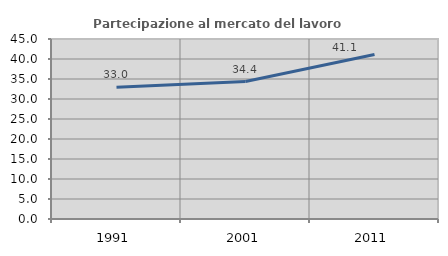
| Category | Partecipazione al mercato del lavoro  femminile |
|---|---|
| 1991.0 | 32.961 |
| 2001.0 | 34.375 |
| 2011.0 | 41.135 |